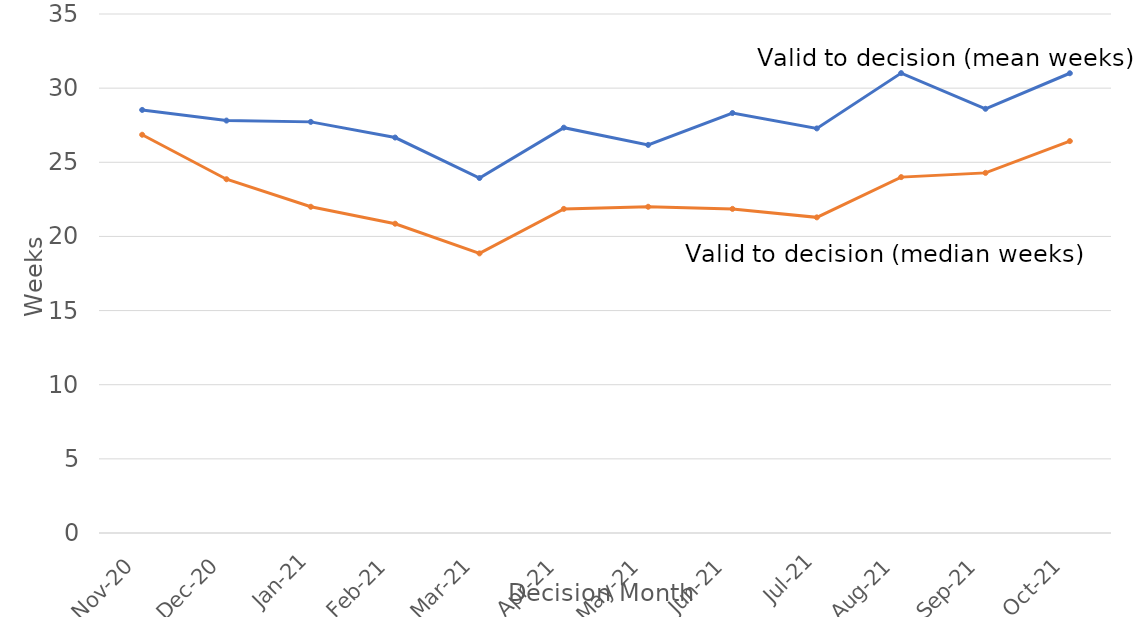
| Category | Valid to Decision  (mean weeks) | Valid to Decision  (median weeks) |
|---|---|---|
| Nov-20 | 28.531 | 26.857 |
| Dec-20 | 27.813 | 23.857 |
| Jan-21 | 27.725 | 22 |
| Feb-21 | 26.669 | 20.857 |
| Mar-21 | 23.94 | 18.857 |
| Apr-21 | 27.335 | 21.857 |
| May-21 | 26.173 | 22 |
| Jun-21 | 28.322 | 21.857 |
| Jul-21 | 27.284 | 21.286 |
| Aug-21 | 31.014 | 24 |
| Sep-21 | 28.607 | 24.286 |
| Oct-21 | 31.004 | 26.429 |